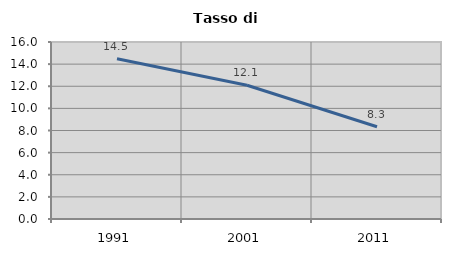
| Category | Tasso di disoccupazione   |
|---|---|
| 1991.0 | 14.484 |
| 2001.0 | 12.095 |
| 2011.0 | 8.34 |